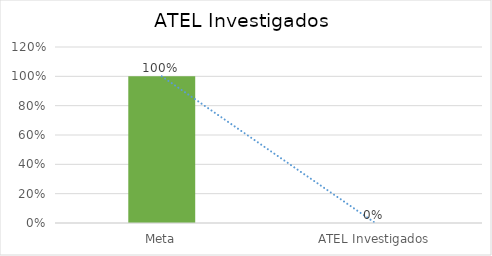
| Category | Series 0 |
|---|---|
| Meta | 1 |
| ATEL Investigados | 0 |